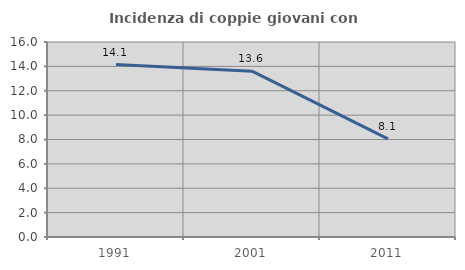
| Category | Incidenza di coppie giovani con figli |
|---|---|
| 1991.0 | 14.145 |
| 2001.0 | 13.608 |
| 2011.0 | 8.054 |